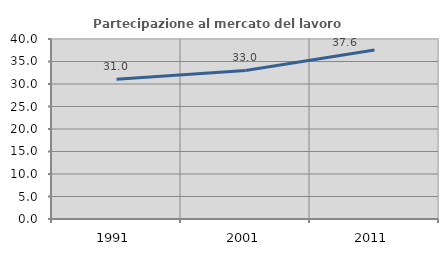
| Category | Partecipazione al mercato del lavoro  femminile |
|---|---|
| 1991.0 | 31.034 |
| 2001.0 | 33.006 |
| 2011.0 | 37.578 |